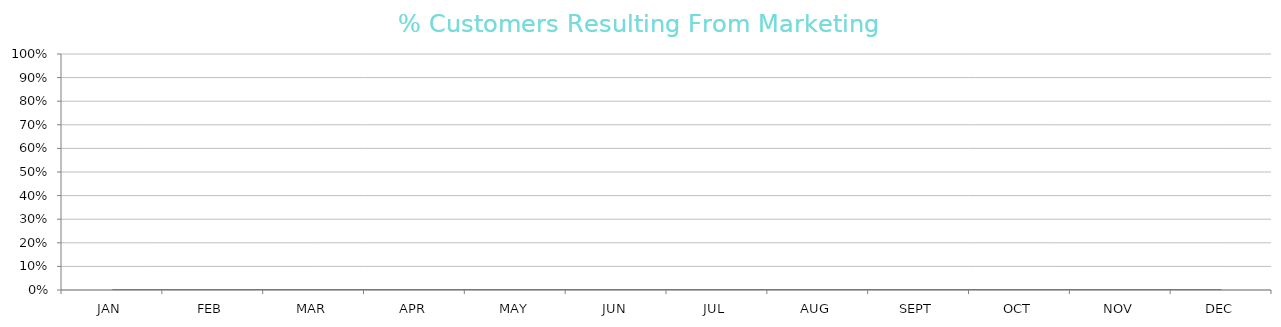
| Category | % Customers from Marketing |
|---|---|
| JAN | 0 |
| FEB | 0 |
| MAR | 0 |
| APR | 0 |
| MAY | 0 |
| JUN | 0 |
| JUL | 0 |
| AUG | 0 |
| SEPT | 0 |
| OCT | 0 |
| NOV | 0 |
| DEC | 0 |